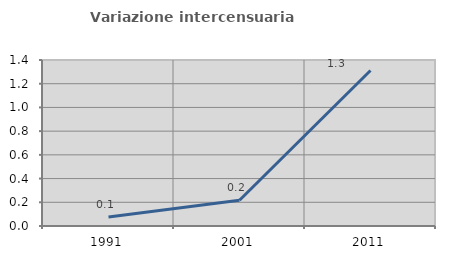
| Category | Variazione intercensuaria annua |
|---|---|
| 1991.0 | 0.076 |
| 2001.0 | 0.218 |
| 2011.0 | 1.311 |